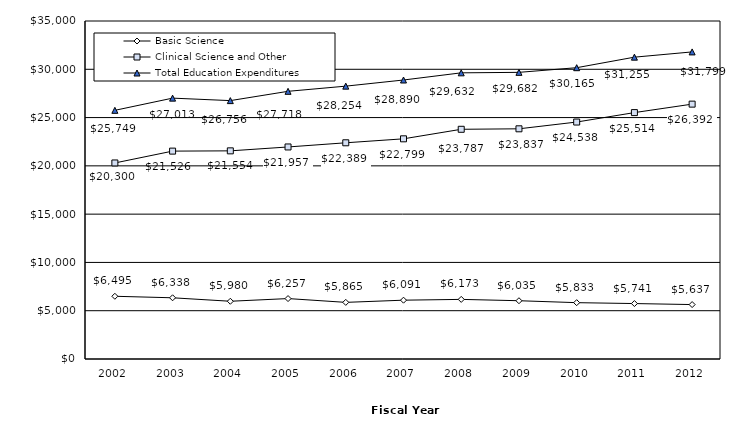
| Category | Basic Science | Clinical Science and Other | Total Education Expenditures |
|---|---|---|---|
| 2002.0 | 6495 | 20300 | 25749 |
| 2003.0 | 6338 | 21526 | 27013 |
| 2004.0 | 5980 | 21554 | 26756 |
| 2005.0 | 6257 | 21957 | 27718 |
| 2006.0 | 5865 | 22389 | 28254 |
| 2007.0 | 6091 | 22799 | 28890 |
| 2008.0 | 6173 | 23787 | 29632 |
| 2009.0 | 6035 | 23837 | 29682 |
| 2010.0 | 5833 | 24538 | 30165 |
| 2011.0 | 5741 | 25514 | 31255 |
| 2012.0 | 5637 | 26392 | 31799 |